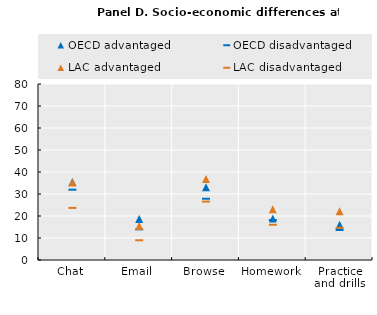
| Category | OECD | LAC |
|---|---|---|
| Chat | 31.964 | 23.689 |
| Email | 13.917 | 8.955 |
| Browse | 27.851 | 26.556 |
| Homework | 18.191 | 16.016 |
| Practice and drills | 13.625 | 14.653 |